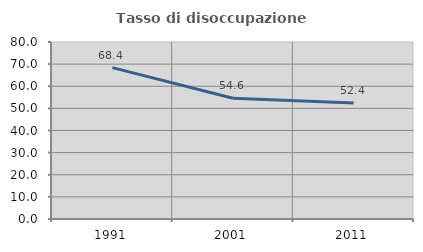
| Category | Tasso di disoccupazione giovanile  |
|---|---|
| 1991.0 | 68.406 |
| 2001.0 | 54.57 |
| 2011.0 | 52.434 |